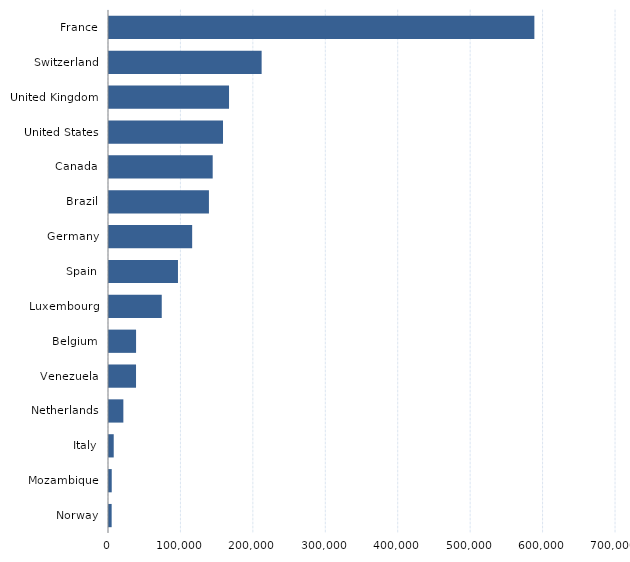
| Category | Series 0 |
|---|---|
| Norway | 3664 |
| Mozambique | 3767 |
| Italy | 6520 |
| Netherlands | 19820 |
| Venezuela | 37326 |
| Belgium | 37376 |
| Luxembourg | 72821 |
| Spain | 95221 |
| Germany | 114825 |
| Brazil | 137973 |
| Canada | 143160 |
| United States | 157418 |
| United Kingdom | 165726 |
| Switzerland | 210731 |
| France | 587300 |